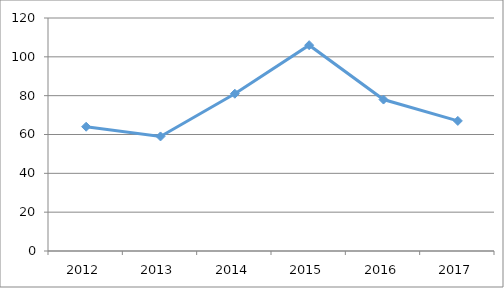
| Category | ESCI-M6O37 |
|---|---|
| 2012.0 | 64 |
| 2013.0 | 59 |
| 2014.0 | 81 |
| 2015.0 | 106 |
| 2016.0 | 78 |
| 2017.0 | 67 |